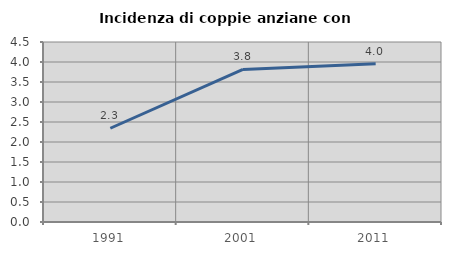
| Category | Incidenza di coppie anziane con figli |
|---|---|
| 1991.0 | 2.344 |
| 2001.0 | 3.814 |
| 2011.0 | 3.957 |